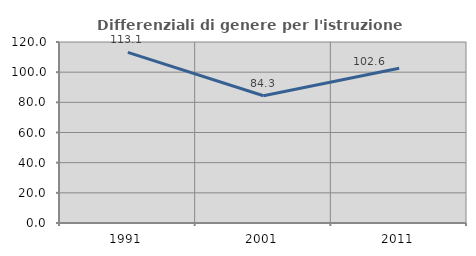
| Category | Differenziali di genere per l'istruzione superiore |
|---|---|
| 1991.0 | 113.125 |
| 2001.0 | 84.349 |
| 2011.0 | 102.566 |